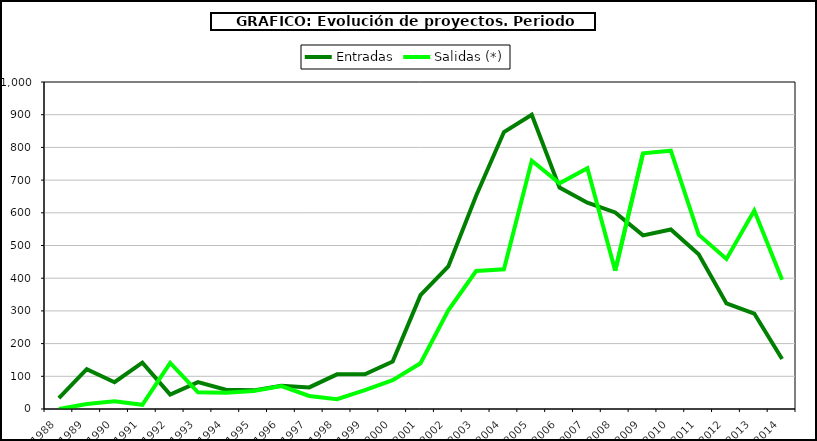
| Category | Entradas | Salidas (*) |
|---|---|---|
| 1988.0 | 33 | 0 |
| 1989.0 | 122 | 15 |
| 1990.0 | 82 | 24 |
| 1991.0 | 142 | 13 |
| 1992.0 | 44 | 141 |
| 1993.0 | 82 | 51 |
| 1994.0 | 59 | 50 |
| 1995.0 | 57 | 55 |
| 1996.0 | 71 | 70 |
| 1997.0 | 66 | 40 |
| 1998.0 | 106 | 30 |
| 1999.0 | 106 | 58 |
| 2000.0 | 145 | 88 |
| 2001.0 | 348 | 140 |
| 2002.0 | 436 | 302 |
| 2003.0 | 652 | 422 |
| 2004.0 | 847 | 427 |
| 2005.0 | 900 | 759 |
| 2006.0 | 677 | 690 |
| 2007.0 | 631 | 736 |
| 2008.0 | 601 | 423 |
| 2009.0 | 531 | 782 |
| 2010.0 | 549 | 790 |
| 2011.0 | 473 | 533 |
| 2012.0 | 323 | 459 |
| 2013.0 | 292 | 607 |
| 2014.0 | 153 | 395 |